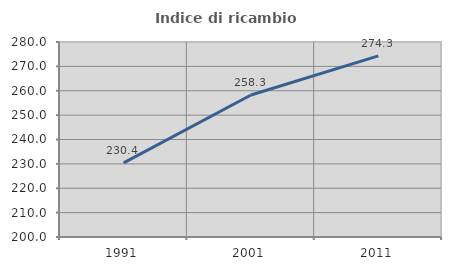
| Category | Indice di ricambio occupazionale  |
|---|---|
| 1991.0 | 230.435 |
| 2001.0 | 258.252 |
| 2011.0 | 274.312 |